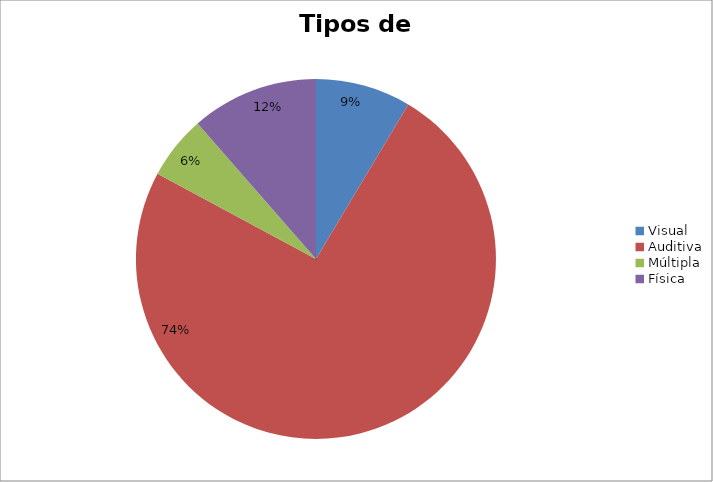
| Category | Quantitativo |
|---|---|
| Visual | 3 |
| Auditiva | 26 |
| Múltipla | 2 |
| Física | 4 |